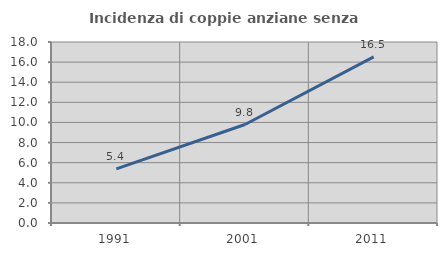
| Category | Incidenza di coppie anziane senza figli  |
|---|---|
| 1991.0 | 5.376 |
| 2001.0 | 9.793 |
| 2011.0 | 16.521 |